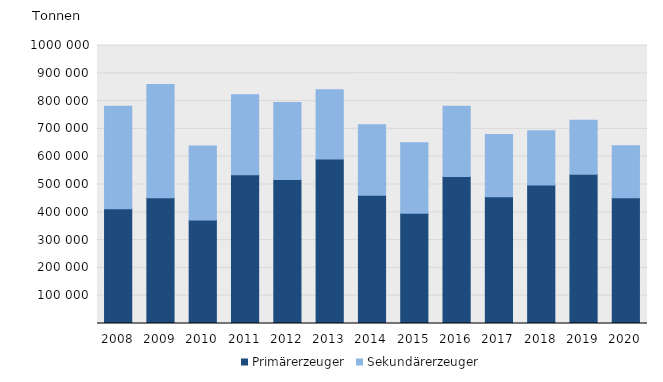
| Category | Primärerzeuger | Sekundärerzeuger |
|---|---|---|
| 2008.0 | 412719 | 368718 |
| 2009.0 | 452024 | 407812 |
| 2010.0 | 371926 | 266534 |
| 2011.0 | 535192 | 287739 |
| 2012.0 | 518083 | 276594 |
| 2013.0 | 591315 | 249291 |
| 2014.0 | 461117 | 253893 |
| 2015.0 | 396331 | 253506 |
| 2016.0 | 528687 | 252656 |
| 2017.0 | 455741 | 223764 |
| 2018.0 | 497812 | 195188 |
| 2019.0 | 536439 | 195089 |
| 2020.0 | 452540 | 187296 |